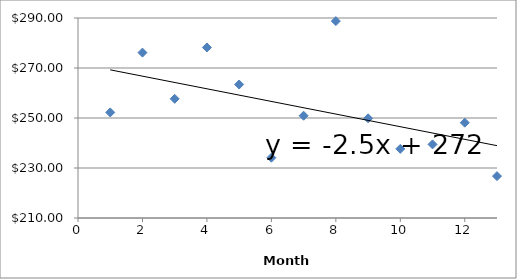
| Category | Series 0 |
|---|---|
| 1.0 | 252.22 |
| 2.0 | 276.16 |
| 3.0 | 257.67 |
| 4.0 | 278.21 |
| 5.0 | 263.4 |
| 6.0 | 234.12 |
| 7.0 | 250.91 |
| 8.0 | 288.76 |
| 9.0 | 249.87 |
| 10.0 | 237.65 |
| 11.0 | 239.45 |
| 12.0 | 248.12 |
| 13.0 | 226.75 |